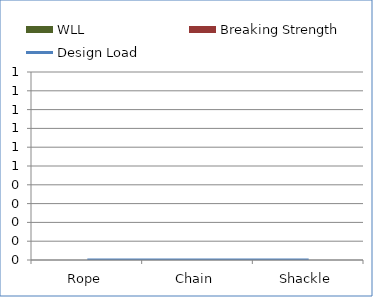
| Category | WLL | Breaking Strength |
|---|---|---|
| 0 | 0 | 0 |
| 1 | 0 | 0 |
| 2 | 0 | 0 |